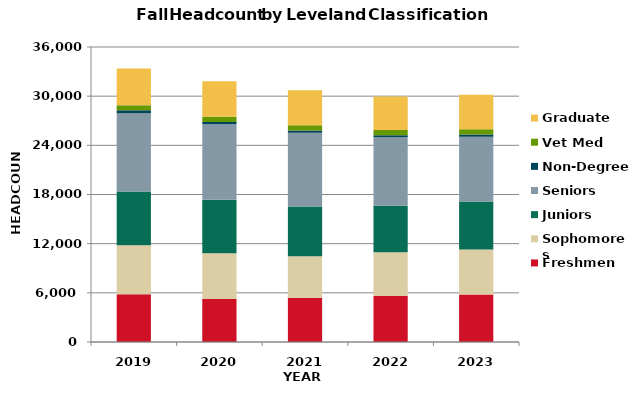
| Category | Freshmen | Sophomores | Juniors | Seniors | Non-Degree | Vet Med | Graduate |
|---|---|---|---|---|---|---|---|
| 2019.0 | 5828 | 5984 | 6565 | 9553 | 364 | 599 | 4498 |
| 2020.0 | 5240 | 5590 | 6540 | 9197 | 279 | 627 | 4352 |
| 2021.0 | 5386 | 5068 | 6088 | 8995 | 271 | 636 | 4264 |
| 2022.0 | 5655 | 5292 | 5694 | 8353 | 247 | 634 | 4094 |
| 2023.0 | 5796 | 5494 | 5855 | 7888 | 299 | 635 | 4210 |